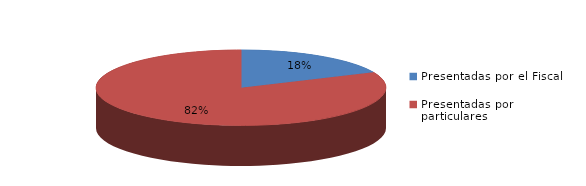
| Category | Series 0 |
|---|---|
| Presentadas por el Fiscal | 33 |
| Presentadas por particulares | 147 |